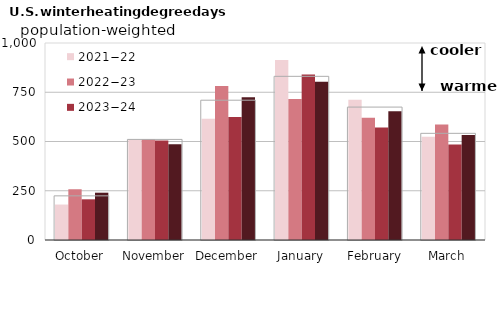
| Category | 2021−22 | 2022−23 | 2023−24 | 2024−25 |
|---|---|---|---|---|
| October | 179.991 | 257.621 | 206.53 | 240.16 |
| November | 509.398 | 511.373 | 504.848 | 486.069 |
| December | 615.697 | 781.206 | 624.288 | 724.574 |
| January | 914.316 | 715.237 | 840.362 | 803.007 |
| February | 712.078 | 621.034 | 571.028 | 653.675 |
| March | 524.74 | 586.014 | 484.893 | 533.03 |